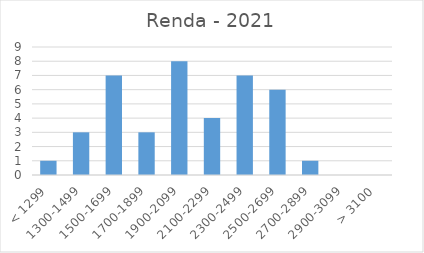
| Category | Series 0 |
|---|---|
| < 1299 | 1 |
| 1300-1499 | 3 |
| 1500-1699 | 7 |
| 1700-1899 | 3 |
| 1900-2099 | 8 |
| 2100-2299 | 4 |
| 2300-2499 | 7 |
| 2500-2699 | 6 |
| 2700-2899 | 1 |
| 2900-3099 | 0 |
| > 3100 | 0 |